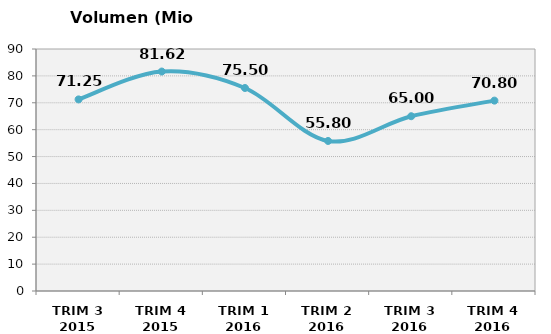
| Category | Volumen (Mio consumiciones) |
|---|---|
| TRIM 3 2015 | 71.253 |
| TRIM 4 2015 | 81.617 |
| TRIM 1 2016 | 75.5 |
| TRIM 2 2016 | 55.8 |
| TRIM 3 2016 | 65 |
| TRIM 4 2016 | 70.8 |